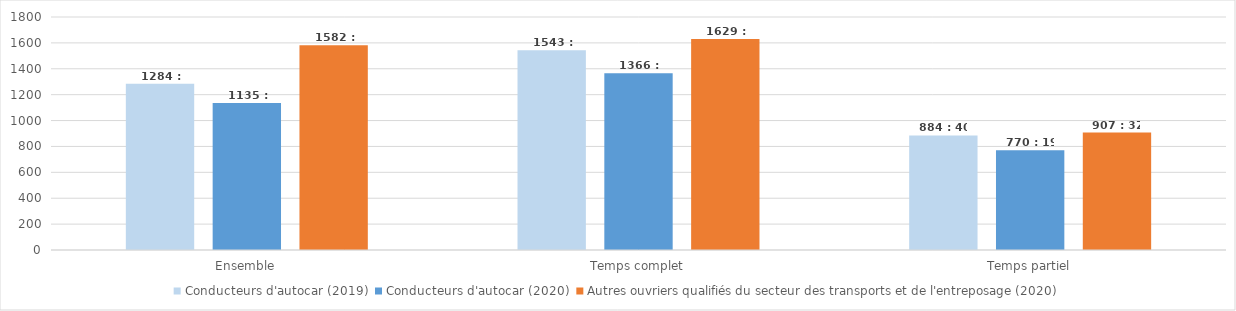
| Category | Conducteurs d'autocar (2019) | Conducteurs d'autocar (2020) | Autres ouvriers qualifiés du secteur des transports et de l'entreposage (2020) |
|---|---|---|---|
| Ensemble | 1284.18 | 1135.32 | 1582.5 |
| Temps complet | 1543.09 | 1366.24 | 1629.93 |
| Temps partiel | 884.67 | 770.32 | 907.53 |